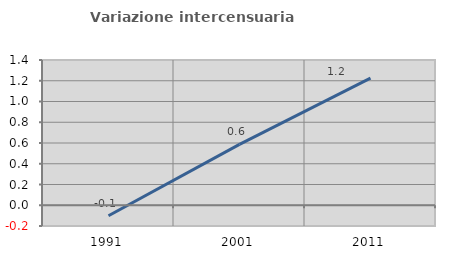
| Category | Variazione intercensuaria annua |
|---|---|
| 1991.0 | -0.101 |
| 2001.0 | 0.587 |
| 2011.0 | 1.225 |